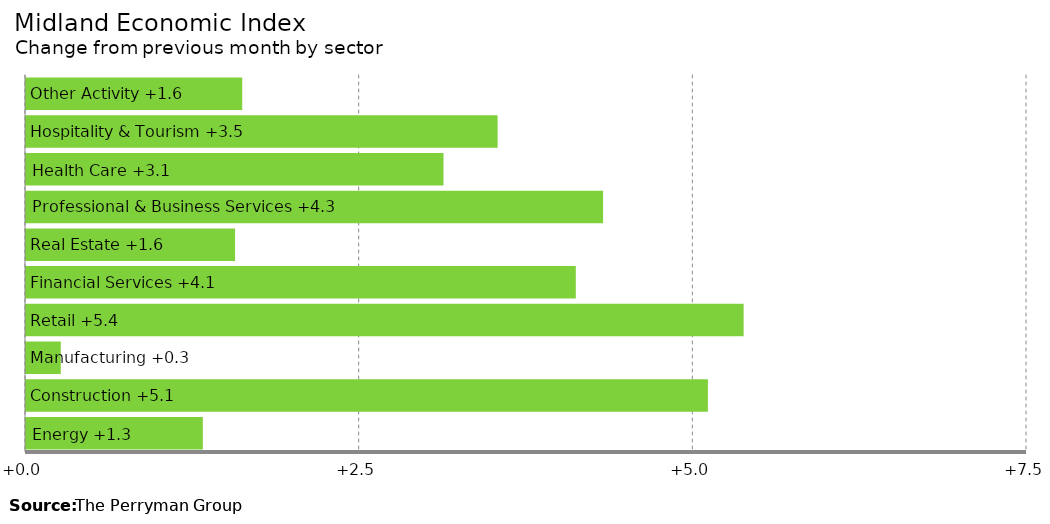
| Category | Change |
|---|---|
| Energy | 1.325 |
| Construction | 5.109 |
| Manufacturing | 0.261 |
| Retail | 5.377 |
| Financial Services | 4.119 |
| Real Estate | 1.566 |
| Professional & Business Services | 4.324 |
| Health Care | 3.128 |
| Hospitality & Tourism | 3.534 |
| Other Activity | 1.62 |